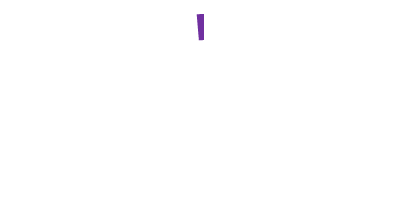
| Category | Series 0 |
|---|---|
| 0 | 98.66 |
| 1 | 1.34 |